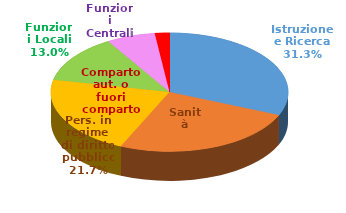
| Category | Series 0 |
|---|---|
| Istruzione e Ricerca | 53947942908 |
| Sanità | 43658950802 |
| Pers. in regime di diritto pubblico | 37265324002 |
| Funzioni Locali | 22392979833 |
| Funzioni Centrali | 11422582640 |
| Comparto aut. o fuori comparto | 3424378117 |